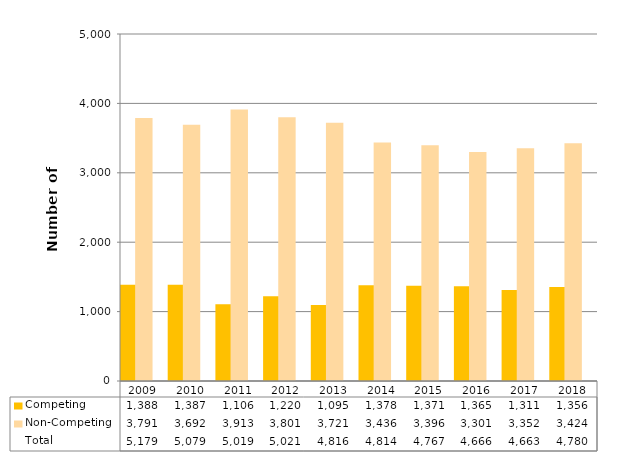
| Category | Competing  | Non-Competing    | Total |
|---|---|---|---|
| 2009.0 | 1388 | 3791 | 5179 |
| 2010.0 | 1387 | 3692 | 5079 |
| 2011.0 | 1106 | 3913 | 5019 |
| 2012.0 | 1220 | 3801 | 5021 |
| 2013.0 | 1095 | 3721 | 4816 |
| 2014.0 | 1378 | 3436 | 4814 |
| 2015.0 | 1371 | 3396 | 4767 |
| 2016.0 | 1365 | 3301 | 4666 |
| 2017.0 | 1311 | 3352 | 4663 |
| 2018.0 | 1356 | 3424 | 4780 |